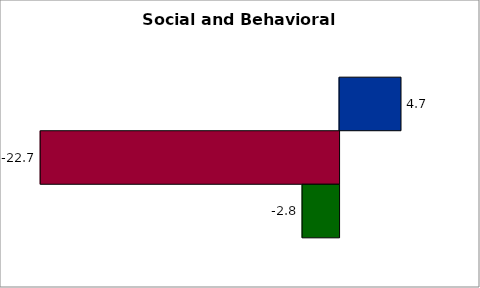
| Category | 50 states and D.C. | SREB states | State |
|---|---|---|---|
| 0 | 4.674 | -22.742 | -2.816 |